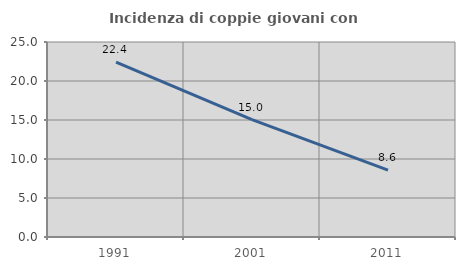
| Category | Incidenza di coppie giovani con figli |
|---|---|
| 1991.0 | 22.424 |
| 2001.0 | 15.05 |
| 2011.0 | 8.567 |